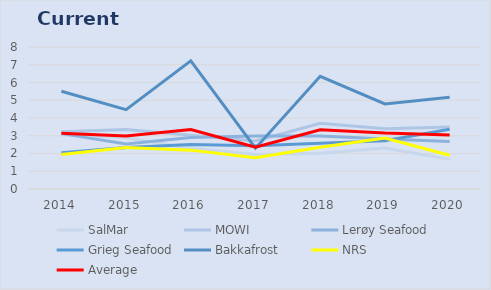
| Category | SalMar | MOWI | Lerøy Seafood | Grieg Seafood | Bakkafrost | NRS | Average |
|---|---|---|---|---|---|---|---|
| 2014.0 | 3.05 | 3.22 | 3.12 | 2.04 | 5.51 | 1.94 | 3.147 |
| 2015.0 | 2.89 | 3.35 | 2.54 | 2.34 | 4.47 | 2.34 | 2.988 |
| 2016.0 | 2.29 | 3.03 | 2.9 | 2.5 | 7.22 | 2.19 | 3.355 |
| 2017.0 | 1.94 | 2.71 | 2.98 | 2.44 | 2.3 | 1.76 | 2.355 |
| 2018.0 | 2.02 | 3.7 | 2.99 | 2.58 | 6.35 | 2.35 | 3.332 |
| 2019.0 | 2.31 | 3.39 | 2.811 | 2.72 | 4.79 | 2.87 | 3.148 |
| 2020.0 | 1.67 | 3.49 | 2.68 | 3.37 | 5.17 | 1.9 | 3.047 |